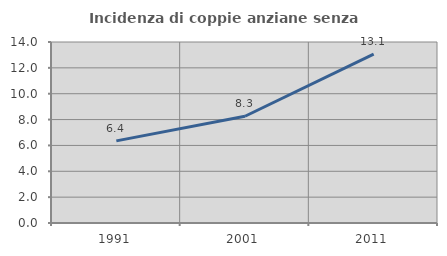
| Category | Incidenza di coppie anziane senza figli  |
|---|---|
| 1991.0 | 6.353 |
| 2001.0 | 8.255 |
| 2011.0 | 13.058 |